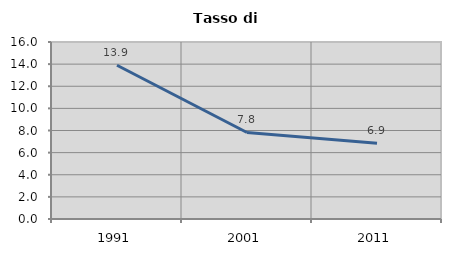
| Category | Tasso di disoccupazione   |
|---|---|
| 1991.0 | 13.9 |
| 2001.0 | 7.823 |
| 2011.0 | 6.858 |